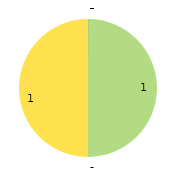
| Category | Thursday | Department |
|---|---|---|
| 0 | 0 | 0 |
| 1 | 1 | 0 |
| 2 | 0 | 0 |
| 3 | 0 | 0 |
| 4 | 1 | 0 |
| 5 | 0 | 0 |
| 6 | 0 | 0 |
| 7 | 0 | 0 |
| 8 | 0 | 0 |
| 9 | 0 | 0 |
| 10 | 0 | 0 |
| 11 | 0 | 0 |
| 12 | 0 | 0 |
| 13 | 0 | 0 |
| 14 | 0 | 0 |
| 15 | 0 | 0 |
| 16 | 0 | 0 |
| 17 | 0 | 0 |
| 18 | 0 | 0 |
| 19 | 0 | 0 |